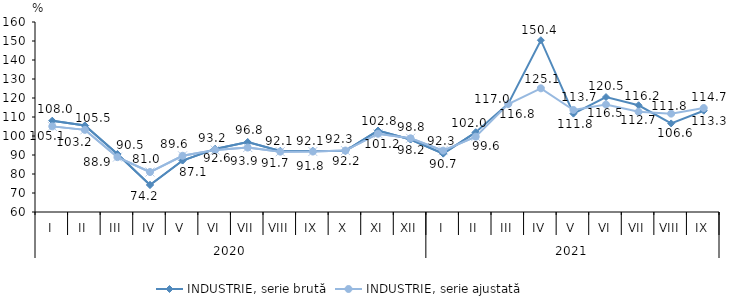
| Category | INDUSTRIE, serie brută | INDUSTRIE, serie ajustată |
|---|---|---|
| 0 | 108.032 | 105.067 |
| 1 | 105.525 | 103.239 |
| 2 | 90.486 | 88.879 |
| 3 | 74.223 | 81.039 |
| 4 | 87.091 | 89.593 |
| 5 | 93.212 | 92.593 |
| 6 | 96.785 | 93.917 |
| 7 | 92.097 | 91.749 |
| 8 | 92.075 | 91.814 |
| 9 | 92.221 | 92.338 |
| 10 | 102.844 | 101.198 |
| 11 | 98.173 | 98.79 |
| 12 | 90.731 | 92.287 |
| 13 | 101.952 | 99.643 |
| 14 | 116.983 | 116.839 |
| 15 | 150.416 | 125.09 |
| 16 | 111.761 | 113.701 |
| 17 | 120.495 | 116.54 |
| 18 | 116.181 | 112.733 |
| 19 | 106.622 | 111.773 |
| 20 | 113.313 | 114.722 |